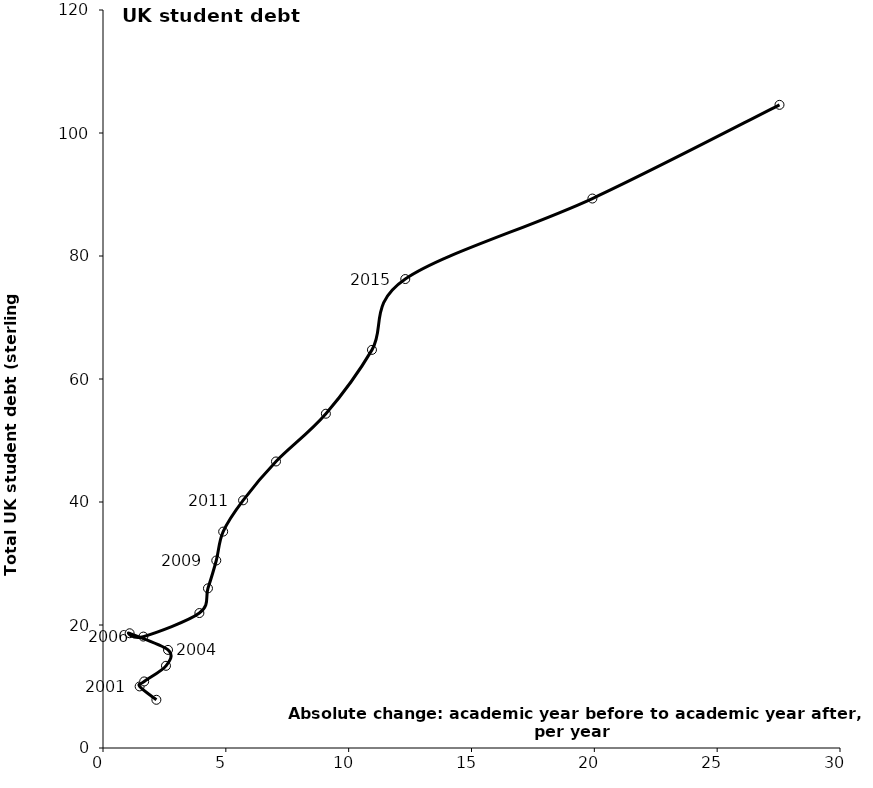
| Category | Series 0 |
|---|---|
| 2.172999999999999 | 7.838 |
| 1.4914999999999998 | 10.011 |
| 1.6765000000000008 | 10.821 |
| 2.5635000000000003 | 13.364 |
| 2.6464999999999996 | 15.948 |
| 1.0839999999999996 | 18.657 |
| 1.6434999999999995 | 18.116 |
| 3.9235000000000007 | 21.944 |
| 4.272500000000001 | 25.963 |
| 4.6114 | 30.489 |
| 4.891499999999999 | 35.186 |
| 5.7021000000000015 | 40.272 |
| 7.0416310597799985 | 46.59 |
| 9.072665897824997 | 54.355 |
| 10.948752925754995 | 64.735 |
| 12.304334102174998 | 76.253 |
| 19.920834102175 | 89.344 |
| 27.537334102175002 | 104.577 |